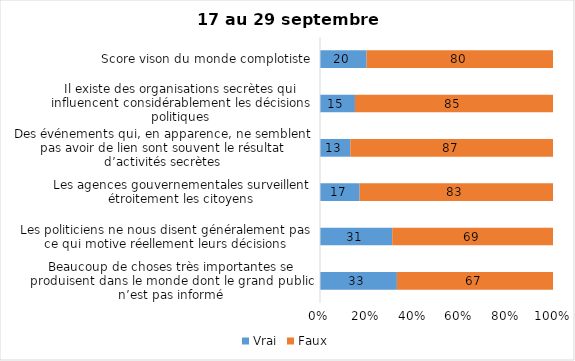
| Category | Vrai | Faux |
|---|---|---|
| Beaucoup de choses très importantes se produisent dans le monde dont le grand public n’est pas informé | 33 | 67 |
| Les politiciens ne nous disent généralement pas ce qui motive réellement leurs décisions | 31 | 69 |
| Les agences gouvernementales surveillent étroitement les citoyens | 17 | 83 |
| Des événements qui, en apparence, ne semblent pas avoir de lien sont souvent le résultat d’activités secrètes | 13 | 87 |
| Il existe des organisations secrètes qui influencent considérablement les décisions politiques | 15 | 85 |
| Score vison du monde complotiste | 20 | 80 |